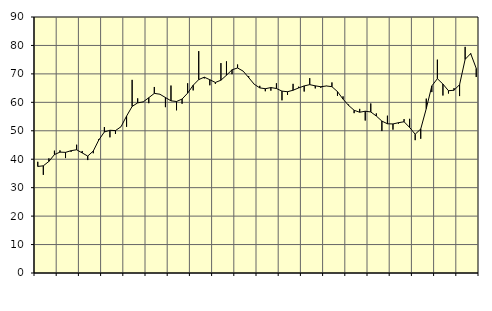
| Category | Piggar | Series 1 |
|---|---|---|
| nan | 39.1 | 37.46 |
| 1.0 | 34.5 | 37.68 |
| 1.0 | 40.3 | 39.23 |
| 1.0 | 43 | 41.63 |
| nan | 43.1 | 42.5 |
| 2.0 | 40.4 | 42.41 |
| 2.0 | 42.6 | 43 |
| 2.0 | 45.1 | 43.33 |
| nan | 42.9 | 42.22 |
| 3.0 | 39.7 | 41.11 |
| 3.0 | 42.1 | 42.87 |
| 3.0 | 47.1 | 46.78 |
| nan | 51.3 | 49.59 |
| 4.0 | 47.7 | 50.17 |
| 4.0 | 48.9 | 50.07 |
| 4.0 | 51.4 | 51.43 |
| nan | 51.4 | 55.16 |
| 5.0 | 67.9 | 58.56 |
| 5.0 | 61.4 | 59.81 |
| 5.0 | 60.1 | 60.16 |
| nan | 59.7 | 61.62 |
| 6.0 | 65.4 | 63.15 |
| 6.0 | 62.9 | 62.85 |
| 6.0 | 58.3 | 61.69 |
| nan | 65.9 | 60.53 |
| 7.0 | 57.2 | 60.29 |
| 7.0 | 59.5 | 61.15 |
| 7.0 | 66.7 | 63.23 |
| nan | 64.2 | 66.01 |
| 8.0 | 78 | 67.99 |
| 8.0 | 68.4 | 68.85 |
| 8.0 | 66 | 67.95 |
| nan | 66.5 | 66.98 |
| 9.0 | 73.8 | 67.78 |
| 9.0 | 74.4 | 69.53 |
| 9.0 | 69.9 | 71.44 |
| nan | 73.3 | 72.08 |
| 10.0 | 71 | 70.98 |
| 10.0 | 69.2 | 68.7 |
| 10.0 | 66.4 | 66.36 |
| nan | 65.8 | 65.08 |
| 11.0 | 63.9 | 64.79 |
| 11.0 | 64.1 | 65.19 |
| 11.0 | 66.7 | 64.86 |
| nan | 60.7 | 63.94 |
| 12.0 | 62.6 | 63.73 |
| 12.0 | 66.5 | 64.25 |
| 12.0 | 65.5 | 65.06 |
| nan | 63.8 | 65.77 |
| 13.0 | 68.5 | 66.22 |
| 13.0 | 64.9 | 65.8 |
| 13.0 | 65.1 | 65.48 |
| nan | 65.8 | 65.75 |
| 14.0 | 67 | 65.51 |
| 14.0 | 62.3 | 63.77 |
| 14.0 | 62.1 | 61.14 |
| nan | 59.2 | 58.92 |
| 15.0 | 56.2 | 57.2 |
| 15.0 | 57.7 | 56.52 |
| 15.0 | 53.6 | 56.87 |
| nan | 59.6 | 56.62 |
| 16.0 | 56.1 | 55.18 |
| 16.0 | 49.9 | 53.41 |
| 16.0 | 55.3 | 52.46 |
| nan | 50.4 | 52.4 |
| 17.0 | 52.5 | 52.84 |
| 17.0 | 54.1 | 53.17 |
| 17.0 | 54.2 | 51.17 |
| nan | 46.7 | 48.78 |
| 18.0 | 47.2 | 50.62 |
| 18.0 | 61.3 | 57.79 |
| 18.0 | 63.6 | 65.77 |
| nan | 75 | 68.31 |
| 19.0 | 62.4 | 66.42 |
| 19.0 | 63.1 | 64.08 |
| 19.0 | 65 | 64.25 |
| nan | 62.2 | 66.2 |
| 20.0 | 79.5 | 75.11 |
| 20.0 | 76.9 | 77.15 |
| 20.0 | 68.9 | 71.95 |